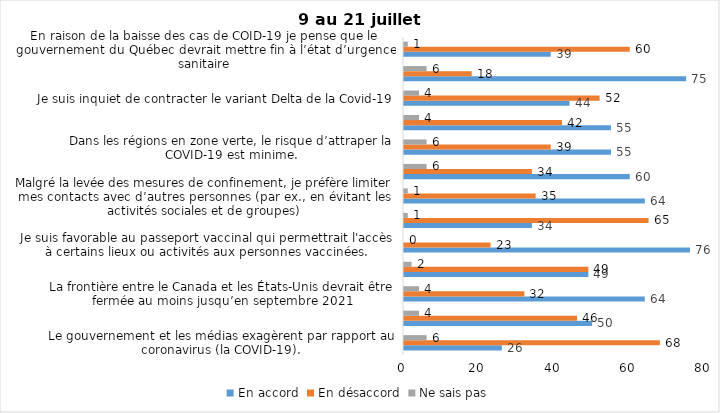
| Category | En accord | En désaccord | Ne sais pas |
|---|---|---|---|
| Le gouvernement et les médias exagèrent par rapport au coronavirus (la COVID-19). | 26 | 68 | 6 |
| J’ai peur que le système de santé soit débordé par les cas de COVID-19 suite au "déconfinement" | 50 | 46 | 4 |
| La frontière entre le Canada et les États-Unis devrait être fermée au moins jusqu’en septembre 2021 | 64 | 32 | 4 |
| Les personnes vaccinées contre la COVID-19 devraient avoir le droit de faire des rassemblements privés et de ne plus porter le masque dans les lieux publics. | 49 | 49 | 2 |
| Je suis favorable au passeport vaccinal qui permettrait l'accès à certains lieux ou activités aux personnes vaccinées. | 76 | 23 | 0 |
| Étant donné la progression de la vaccination et la diminution du nombre de cas de COVID-19, je pense qu’il est moins important de suivre les mesures de prévention. | 34 | 65 | 1 |
| Malgré la levée des mesures de confinement, je préfère limiter mes contacts avec d’autres personnes (par ex., en évitant les activités sociales et de groupes) | 64 | 35 | 1 |
| J’ai peur qu’il y ait une 4e vague de la COVID-19. | 60 | 34 | 6 |
| Dans les régions en zone verte, le risque d’attraper la COVID-19 est minime. | 55 | 39 | 6 |
| Si les cas de COVID-19 augmentent cet automne, je suis favorable à la mise en place de mesures de confinement (ex. fermeture de services non essentiels, interdiction des rassemblements privés) | 55 | 42 | 4 |
| Je suis inquiet de contracter le variant Delta de la Covid-19 | 44 | 52 | 4 |
| Je suis confiant que la vaccination protège efficacement contre les variants de la COVID-19 | 75 | 18 | 6 |
| En raison de la baisse des cas de COID-19 je pense que le gouvernement du Québec devrait mettre fin à l’état d’urgence sanitaire | 39 | 60 | 1 |